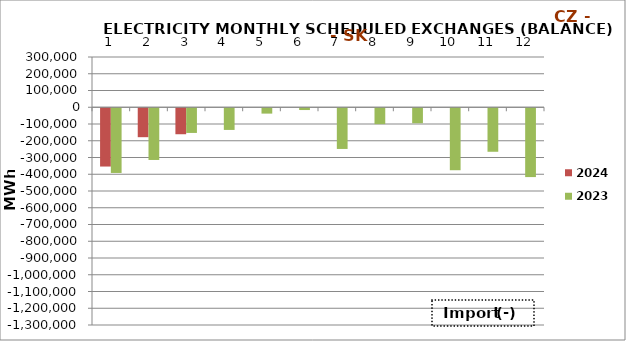
| Category | 2024 | 2023 |
|---|---|---|
| 0 | -348027 | -386324.7 |
| 1 | -172761.4 | -308766.1 |
| 2 | -155178.8 | -147387.7 |
| 3 | 0 | -129446.5 |
| 4 | 0 | -32010.3 |
| 5 | 0 | -10652.4 |
| 6 | 0 | -243010.4 |
| 7 | 0 | -94879.3 |
| 8 | 0 | -89468.2 |
| 9 | 0 | -370007.5 |
| 10 | 0 | -259810.2 |
| 11 | 0 | -410898 |